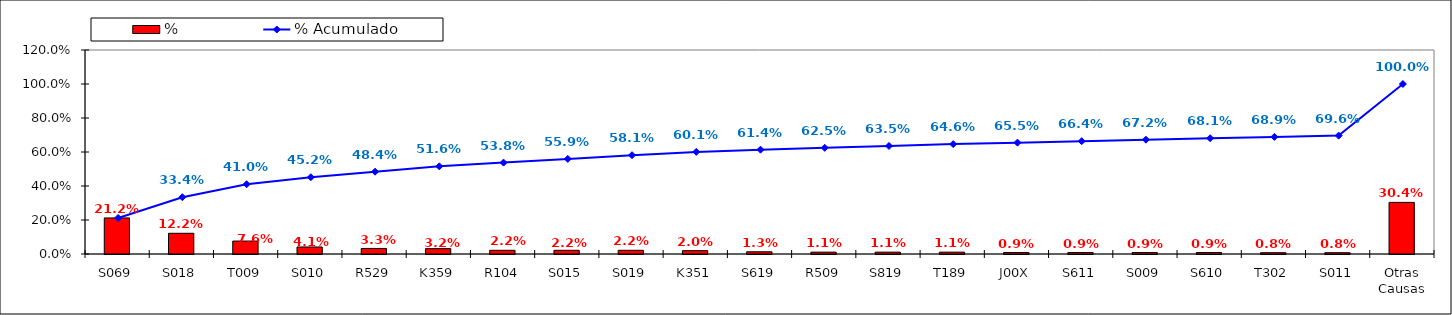
| Category | % |
|---|---|
| S069 | 0.212 |
| S018 | 0.122 |
| T009 | 0.076 |
| S010 | 0.041 |
| R529 | 0.033 |
| K359 | 0.032 |
| R104 | 0.022 |
| S015 | 0.022 |
| S019 | 0.022 |
| K351 | 0.02 |
| S619 | 0.013 |
| R509 | 0.011 |
| S819 | 0.011 |
| T189 | 0.011 |
| J00X | 0.009 |
| S611 | 0.009 |
| S009 | 0.009 |
| S610 | 0.009 |
| T302 | 0.008 |
| S011 | 0.008 |
| Otras Causas | 0.304 |